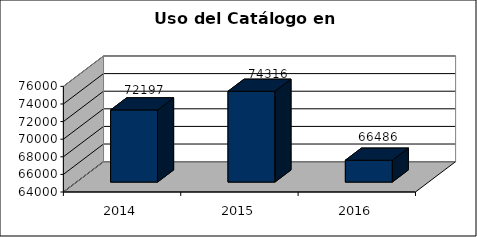
| Category | Consultas Catálogo |
|---|---|
| 2014.0 | 72197 |
| 2015.0 | 74316 |
| 2016.0 | 66486 |